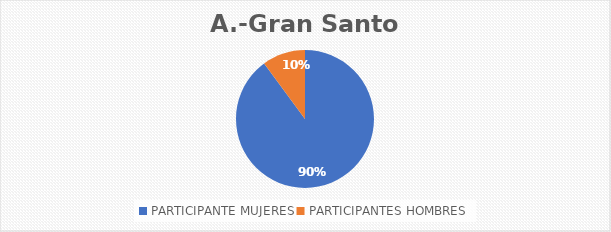
| Category | A.-Gran Santo Domingo |
|---|---|
| PARTICIPANTE MUJERES | 294 |
| PARTICIPANTES HOMBRES | 33 |